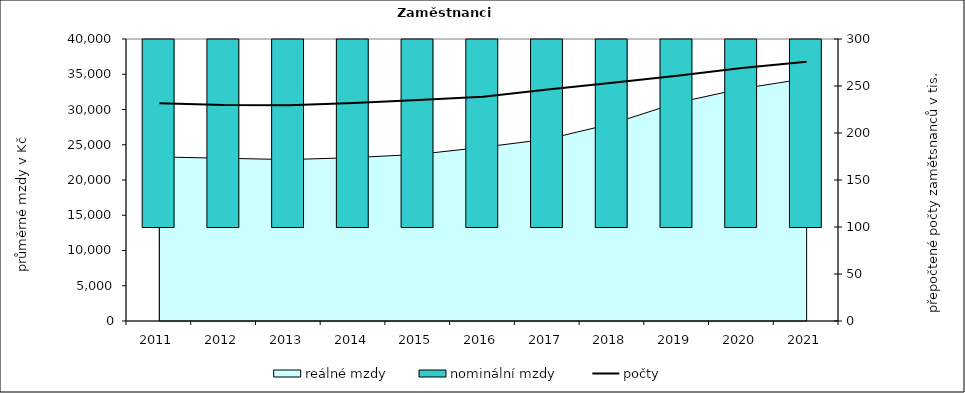
| Category | nominální mzdy  |
|---|---|
| 2011.0 | 22059.453 |
| 2012.0 | 22600.393 |
| 2013.0 | 22736.16 |
| 2014.0 | 23105.299 |
| 2015.0 | 23637.347 |
| 2016.0 | 24814.03 |
| 2017.0 | 26608.582 |
| 2018.0 | 29476 |
| 2019.0 | 33529.756 |
| 2020.0 | 36857.887 |
| 2021.0 | 39591.418 |